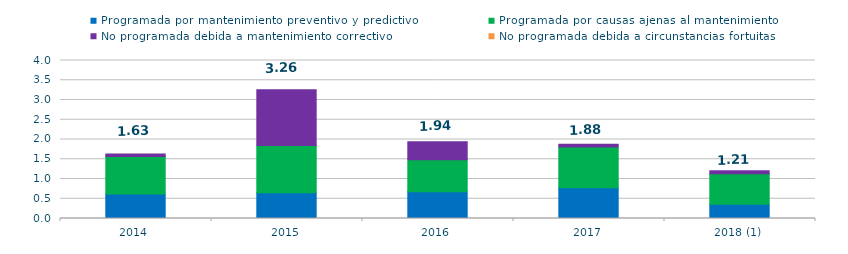
| Category | Programada por mantenimiento preventivo y predictivo | Programada por causas ajenas al mantenimiento  | No programada debida a mantenimiento correctivo  | No programada debida a circunstancias fortuitas  |
|---|---|---|---|---|
| 2014 | 0.62 | 0.95 | 0.06 | 0 |
| 2015 | 0.65 | 1.2 | 1.41 | 0 |
| 2016 | 0.68 | 0.81 | 0.45 | 0 |
| 2017 | 0.78 | 1.03 | 0.07 | 0 |
| 2018 (1) | 0.36 | 0.77 | 0.08 | 0 |